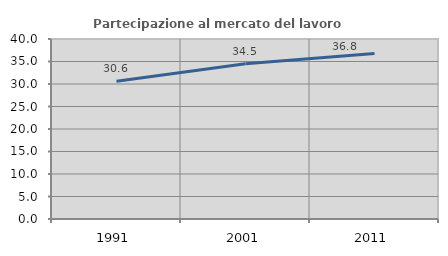
| Category | Partecipazione al mercato del lavoro  femminile |
|---|---|
| 1991.0 | 30.634 |
| 2001.0 | 34.487 |
| 2011.0 | 36.779 |